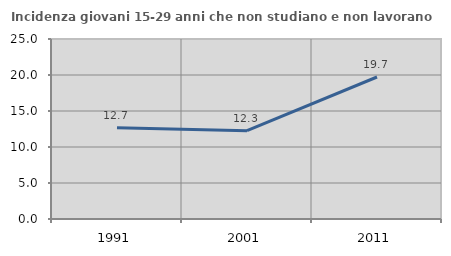
| Category | Incidenza giovani 15-29 anni che non studiano e non lavorano  |
|---|---|
| 1991.0 | 12.668 |
| 2001.0 | 12.27 |
| 2011.0 | 19.722 |